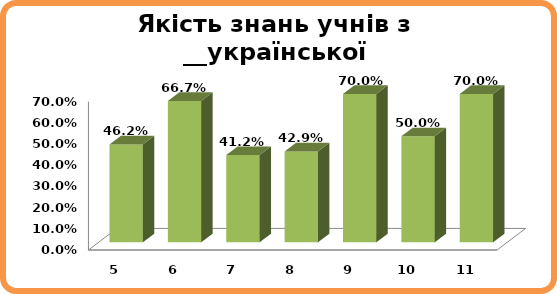
| Category | Series 0 |
|---|---|
| 5.0 | 0.462 |
| 6.0 | 0.667 |
| 7.0 | 0.412 |
| 8.0 | 0.429 |
| 9.0 | 0.7 |
| 10.0 | 0.5 |
| 11.0 | 0.7 |